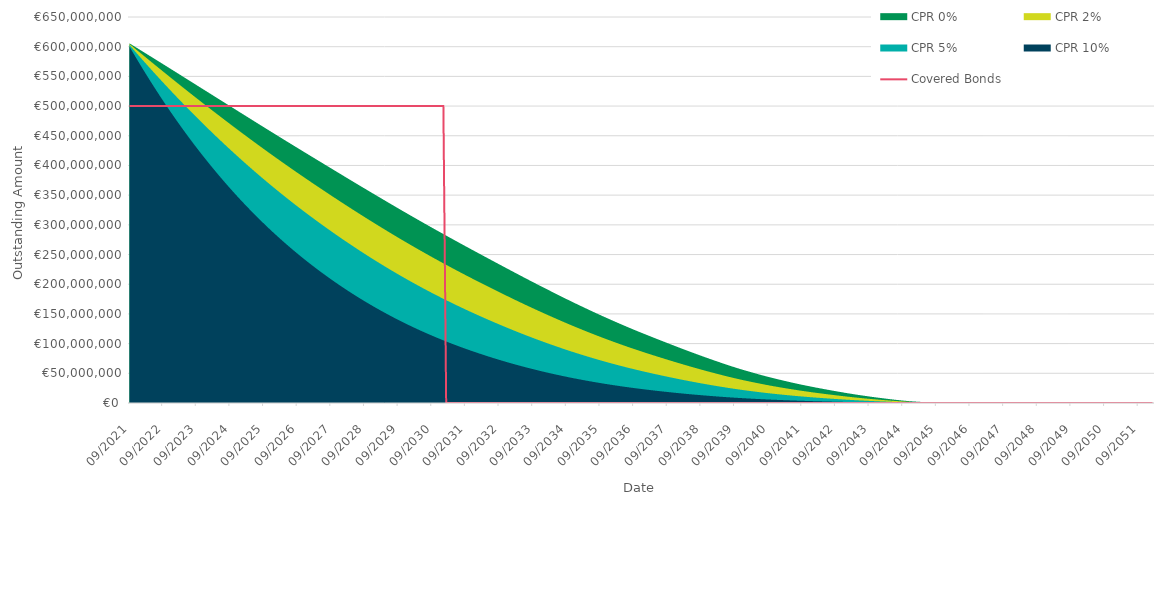
| Category | Covered Bonds |
|---|---|
| 2021-09-30 | 500000000 |
| 2021-10-31 | 500000000 |
| 2021-11-30 | 500000000 |
| 2021-12-31 | 500000000 |
| 2022-01-31 | 500000000 |
| 2022-02-28 | 500000000 |
| 2022-03-31 | 500000000 |
| 2022-04-30 | 500000000 |
| 2022-05-31 | 500000000 |
| 2022-06-30 | 500000000 |
| 2022-07-31 | 500000000 |
| 2022-08-31 | 500000000 |
| 2022-09-30 | 500000000 |
| 2022-10-31 | 500000000 |
| 2022-11-30 | 500000000 |
| 2022-12-31 | 500000000 |
| 2023-01-31 | 500000000 |
| 2023-02-28 | 500000000 |
| 2023-03-31 | 500000000 |
| 2023-04-30 | 500000000 |
| 2023-05-31 | 500000000 |
| 2023-06-30 | 500000000 |
| 2023-07-31 | 500000000 |
| 2023-08-31 | 500000000 |
| 2023-09-30 | 500000000 |
| 2023-10-31 | 500000000 |
| 2023-11-30 | 500000000 |
| 2023-12-31 | 500000000 |
| 2024-01-31 | 500000000 |
| 2024-02-29 | 500000000 |
| 2024-03-31 | 500000000 |
| 2024-04-30 | 500000000 |
| 2024-05-31 | 500000000 |
| 2024-06-30 | 500000000 |
| 2024-07-31 | 500000000 |
| 2024-08-31 | 500000000 |
| 2024-09-30 | 500000000 |
| 2024-10-31 | 500000000 |
| 2024-11-30 | 500000000 |
| 2024-12-31 | 500000000 |
| 2025-01-31 | 500000000 |
| 2025-02-28 | 500000000 |
| 2025-03-31 | 500000000 |
| 2025-04-30 | 500000000 |
| 2025-05-31 | 500000000 |
| 2025-06-30 | 500000000 |
| 2025-07-31 | 500000000 |
| 2025-08-31 | 500000000 |
| 2025-09-30 | 500000000 |
| 2025-10-31 | 500000000 |
| 2025-11-30 | 500000000 |
| 2025-12-31 | 500000000 |
| 2026-01-31 | 500000000 |
| 2026-02-28 | 500000000 |
| 2026-03-31 | 500000000 |
| 2026-04-30 | 500000000 |
| 2026-05-31 | 500000000 |
| 2026-06-30 | 500000000 |
| 2026-07-31 | 500000000 |
| 2026-08-31 | 500000000 |
| 2026-09-30 | 500000000 |
| 2026-10-31 | 500000000 |
| 2026-11-30 | 500000000 |
| 2026-12-31 | 500000000 |
| 2027-01-31 | 500000000 |
| 2027-02-28 | 500000000 |
| 2027-03-31 | 500000000 |
| 2027-04-30 | 500000000 |
| 2027-05-31 | 500000000 |
| 2027-06-30 | 500000000 |
| 2027-07-31 | 500000000 |
| 2027-08-31 | 500000000 |
| 2027-09-30 | 500000000 |
| 2027-10-31 | 500000000 |
| 2027-11-30 | 500000000 |
| 2027-12-31 | 500000000 |
| 2028-01-31 | 500000000 |
| 2028-02-29 | 500000000 |
| 2028-03-31 | 500000000 |
| 2028-04-30 | 500000000 |
| 2028-05-31 | 500000000 |
| 2028-06-30 | 500000000 |
| 2028-07-31 | 500000000 |
| 2028-08-31 | 500000000 |
| 2028-09-30 | 500000000 |
| 2028-10-31 | 500000000 |
| 2028-11-30 | 500000000 |
| 2028-12-31 | 500000000 |
| 2029-01-31 | 500000000 |
| 2029-02-28 | 500000000 |
| 2029-03-31 | 500000000 |
| 2029-04-30 | 500000000 |
| 2029-05-31 | 500000000 |
| 2029-06-30 | 500000000 |
| 2029-07-31 | 500000000 |
| 2029-08-31 | 500000000 |
| 2029-09-30 | 500000000 |
| 2029-10-31 | 500000000 |
| 2029-11-30 | 500000000 |
| 2029-12-31 | 500000000 |
| 2030-01-31 | 500000000 |
| 2030-02-28 | 500000000 |
| 2030-03-31 | 500000000 |
| 2030-04-30 | 500000000 |
| 2030-05-31 | 500000000 |
| 2030-06-30 | 500000000 |
| 2030-07-31 | 500000000 |
| 2030-08-31 | 500000000 |
| 2030-09-30 | 500000000 |
| 2030-10-31 | 500000000 |
| 2030-11-30 | 500000000 |
| 2030-12-31 | 500000000 |
| 2031-01-31 | 500000000 |
| 2031-02-28 | 0 |
| 2031-03-31 | 0 |
| 2031-04-30 | 0 |
| 2031-05-31 | 0 |
| 2031-06-30 | 0 |
| 2031-07-31 | 0 |
| 2031-08-31 | 0 |
| 2031-09-30 | 0 |
| 2031-10-31 | 0 |
| 2031-11-30 | 0 |
| 2031-12-31 | 0 |
| 2032-01-31 | 0 |
| 2032-02-29 | 0 |
| 2032-03-31 | 0 |
| 2032-04-30 | 0 |
| 2032-05-31 | 0 |
| 2032-06-30 | 0 |
| 2032-07-31 | 0 |
| 2032-08-31 | 0 |
| 2032-09-30 | 0 |
| 2032-10-31 | 0 |
| 2032-11-30 | 0 |
| 2032-12-31 | 0 |
| 2033-01-31 | 0 |
| 2033-02-28 | 0 |
| 2033-03-31 | 0 |
| 2033-04-30 | 0 |
| 2033-05-31 | 0 |
| 2033-06-30 | 0 |
| 2033-07-31 | 0 |
| 2033-08-31 | 0 |
| 2033-09-30 | 0 |
| 2033-10-31 | 0 |
| 2033-11-30 | 0 |
| 2033-12-31 | 0 |
| 2034-01-31 | 0 |
| 2034-02-28 | 0 |
| 2034-03-31 | 0 |
| 2034-04-30 | 0 |
| 2034-05-31 | 0 |
| 2034-06-30 | 0 |
| 2034-07-31 | 0 |
| 2034-08-31 | 0 |
| 2034-09-30 | 0 |
| 2034-10-31 | 0 |
| 2034-11-30 | 0 |
| 2034-12-31 | 0 |
| 2035-01-31 | 0 |
| 2035-02-28 | 0 |
| 2035-03-31 | 0 |
| 2035-04-30 | 0 |
| 2035-05-31 | 0 |
| 2035-06-30 | 0 |
| 2035-07-31 | 0 |
| 2035-08-31 | 0 |
| 2035-09-30 | 0 |
| 2035-10-31 | 0 |
| 2035-11-30 | 0 |
| 2035-12-31 | 0 |
| 2036-01-31 | 0 |
| 2036-02-29 | 0 |
| 2036-03-31 | 0 |
| 2036-04-30 | 0 |
| 2036-05-31 | 0 |
| 2036-06-30 | 0 |
| 2036-07-31 | 0 |
| 2036-08-31 | 0 |
| 2036-09-30 | 0 |
| 2036-10-31 | 0 |
| 2036-11-30 | 0 |
| 2036-12-31 | 0 |
| 2037-01-31 | 0 |
| 2037-02-28 | 0 |
| 2037-03-31 | 0 |
| 2037-04-30 | 0 |
| 2037-05-31 | 0 |
| 2037-06-30 | 0 |
| 2037-07-31 | 0 |
| 2037-08-31 | 0 |
| 2037-09-30 | 0 |
| 2037-10-31 | 0 |
| 2037-11-30 | 0 |
| 2037-12-31 | 0 |
| 2038-01-31 | 0 |
| 2038-02-28 | 0 |
| 2038-03-31 | 0 |
| 2038-04-30 | 0 |
| 2038-05-31 | 0 |
| 2038-06-30 | 0 |
| 2038-07-31 | 0 |
| 2038-08-31 | 0 |
| 2038-09-30 | 0 |
| 2038-10-31 | 0 |
| 2038-11-30 | 0 |
| 2038-12-31 | 0 |
| 2039-01-31 | 0 |
| 2039-02-28 | 0 |
| 2039-03-31 | 0 |
| 2039-04-30 | 0 |
| 2039-05-31 | 0 |
| 2039-06-30 | 0 |
| 2039-07-31 | 0 |
| 2039-08-31 | 0 |
| 2039-09-30 | 0 |
| 2039-10-31 | 0 |
| 2039-11-30 | 0 |
| 2039-12-31 | 0 |
| 2040-01-31 | 0 |
| 2040-02-29 | 0 |
| 2040-03-31 | 0 |
| 2040-04-30 | 0 |
| 2040-05-31 | 0 |
| 2040-06-30 | 0 |
| 2040-07-31 | 0 |
| 2040-08-31 | 0 |
| 2040-09-30 | 0 |
| 2040-10-31 | 0 |
| 2040-11-30 | 0 |
| 2040-12-31 | 0 |
| 2041-01-31 | 0 |
| 2041-02-28 | 0 |
| 2041-03-31 | 0 |
| 2041-04-30 | 0 |
| 2041-05-31 | 0 |
| 2041-06-30 | 0 |
| 2041-07-31 | 0 |
| 2041-08-31 | 0 |
| 2041-09-30 | 0 |
| 2041-10-31 | 0 |
| 2041-11-30 | 0 |
| 2041-12-31 | 0 |
| 2042-01-31 | 0 |
| 2042-02-28 | 0 |
| 2042-03-31 | 0 |
| 2042-04-30 | 0 |
| 2042-05-31 | 0 |
| 2042-06-30 | 0 |
| 2042-07-31 | 0 |
| 2042-08-31 | 0 |
| 2042-09-30 | 0 |
| 2042-10-31 | 0 |
| 2042-11-30 | 0 |
| 2042-12-31 | 0 |
| 2043-01-31 | 0 |
| 2043-02-28 | 0 |
| 2043-03-31 | 0 |
| 2043-04-30 | 0 |
| 2043-05-31 | 0 |
| 2043-06-30 | 0 |
| 2043-07-31 | 0 |
| 2043-08-31 | 0 |
| 2043-09-30 | 0 |
| 2043-10-31 | 0 |
| 2043-11-30 | 0 |
| 2043-12-31 | 0 |
| 2044-01-31 | 0 |
| 2044-02-29 | 0 |
| 2044-03-31 | 0 |
| 2044-04-30 | 0 |
| 2044-05-31 | 0 |
| 2044-06-30 | 0 |
| 2044-07-31 | 0 |
| 2044-08-31 | 0 |
| 2044-09-30 | 0 |
| 2044-10-31 | 0 |
| 2044-11-30 | 0 |
| 2044-12-31 | 0 |
| 2045-01-31 | 0 |
| 2045-02-28 | 0 |
| 2045-03-31 | 0 |
| 2045-04-30 | 0 |
| 2045-05-31 | 0 |
| 2045-06-30 | 0 |
| 2045-07-31 | 0 |
| 2045-08-31 | 0 |
| 2045-09-30 | 0 |
| 2045-10-31 | 0 |
| 2045-11-30 | 0 |
| 2045-12-31 | 0 |
| 2046-01-31 | 0 |
| 2046-02-28 | 0 |
| 2046-03-31 | 0 |
| 2046-04-30 | 0 |
| 2046-05-31 | 0 |
| 2046-06-30 | 0 |
| 2046-07-31 | 0 |
| 2046-08-31 | 0 |
| 2046-09-30 | 0 |
| 2046-10-31 | 0 |
| 2046-11-30 | 0 |
| 2046-12-31 | 0 |
| 2047-01-31 | 0 |
| 2047-02-28 | 0 |
| 2047-03-31 | 0 |
| 2047-04-30 | 0 |
| 2047-05-31 | 0 |
| 2047-06-30 | 0 |
| 2047-07-31 | 0 |
| 2047-08-31 | 0 |
| 2047-09-30 | 0 |
| 2047-10-31 | 0 |
| 2047-11-30 | 0 |
| 2047-12-31 | 0 |
| 2048-01-31 | 0 |
| 2048-02-29 | 0 |
| 2048-03-31 | 0 |
| 2048-04-30 | 0 |
| 2048-05-31 | 0 |
| 2048-06-30 | 0 |
| 2048-07-31 | 0 |
| 2048-08-31 | 0 |
| 2048-09-30 | 0 |
| 2048-10-31 | 0 |
| 2048-11-30 | 0 |
| 2048-12-31 | 0 |
| 2049-01-31 | 0 |
| 2049-02-28 | 0 |
| 2049-03-31 | 0 |
| 2049-04-30 | 0 |
| 2049-05-31 | 0 |
| 2049-06-30 | 0 |
| 2049-07-31 | 0 |
| 2049-08-31 | 0 |
| 2049-09-30 | 0 |
| 2049-10-31 | 0 |
| 2049-11-30 | 0 |
| 2049-12-31 | 0 |
| 2050-01-31 | 0 |
| 2050-02-28 | 0 |
| 2050-03-31 | 0 |
| 2050-04-30 | 0 |
| 2050-05-31 | 0 |
| 2050-06-30 | 0 |
| 2050-07-31 | 0 |
| 2050-08-31 | 0 |
| 2050-09-30 | 0 |
| 2050-10-31 | 0 |
| 2050-11-30 | 0 |
| 2050-12-31 | 0 |
| 2051-01-31 | 0 |
| 2051-02-28 | 0 |
| 2051-03-31 | 0 |
| 2051-04-30 | 0 |
| 2051-05-31 | 0 |
| 2051-06-30 | 0 |
| 2051-07-31 | 0 |
| 2051-08-31 | 0 |
| 2051-09-30 | 0 |
| 2051-10-31 | 0 |
| 2051-11-30 | 0 |
| 2051-12-31 | 0 |
| 2052-01-31 | 0 |
| 2052-02-29 | 0 |